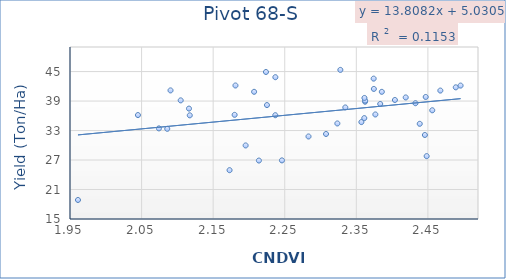
| Category | Series 0 |
|---|---|
| 2.446933 | 39.83 |
| 2.374241 | 43.563 |
| 2.432608 | 38.557 |
| 2.448271 | 27.79 |
| 2.467399 | 41.133 |
| 2.362215 | 38.86 |
| 2.456106 | 37.12 |
| 2.419022 | 39.733 |
| 2.362322 | 39.09 |
| 2.357099 | 34.72 |
| 2.32769 | 45.34 |
| 2.181148 | 42.167 |
| 2.225167 | 38.18 |
| 2.044929 | 36.147 |
| 2.195372 | 29.967 |
| 2.172918 | 24.933 |
| 1.961136 | 18.867 |
| 2.09043 | 41.167 |
| 2.438615 | 34.367 |
| 2.236908 | 43.853 |
| 2.074206 | 33.437 |
| 2.385636 | 40.877 |
| 2.376602 | 36.27 |
| 2.361128 | 35.523 |
| 2.488959 | 41.79 |
| 2.495642 | 42.147 |
| 2.36135 | 39.63 |
| 2.307674 | 32.297 |
| 2.374502 | 41.467 |
| 2.383384 | 38.41 |
| 2.236812 | 36.117 |
| 2.246094 | 26.927 |
| 2.334626 | 37.697 |
| 2.213899 | 26.893 |
| 2.117323 | 36.093 |
| 2.207205 | 40.88 |
| 2.116232 | 37.467 |
| 2.223761 | 44.913 |
| 2.08585 | 33.35 |
| 2.403911 | 39.217 |
| 2.283218 | 31.79 |
| 2.104652 | 39.14 |
| 2.323509 | 34.44 |
| 2.179986 | 36.193 |
| 2.445795 | 32.093 |